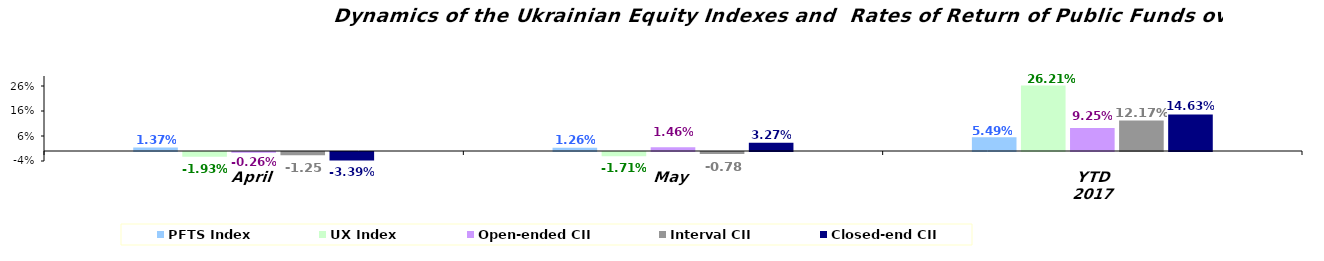
| Category | PFTS Index | UX Index | Open-ended CII | Interval CII | Closed-end CII |
|---|---|---|---|---|---|
| April | 0.014 | -0.019 | -0.003 | -0.013 | -0.034 |
| May | 0.013 | -0.017 | 0.015 | -0.008 | 0.033 |
| YTD 2017 | 0.055 | 0.262 | 0.092 | 0.122 | 0.146 |